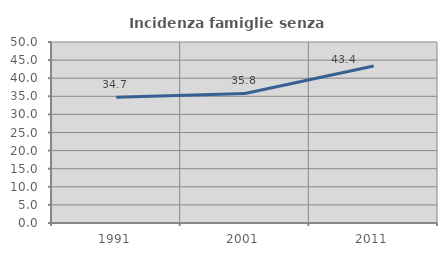
| Category | Incidenza famiglie senza nuclei |
|---|---|
| 1991.0 | 34.72 |
| 2001.0 | 35.775 |
| 2011.0 | 43.364 |